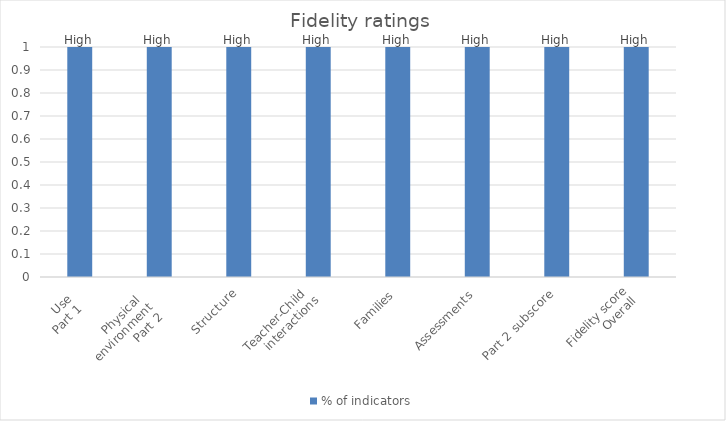
| Category | % of indicators |
|---|---|
| 0 | 1 |
| 1 | 1 |
| 2 | 1 |
| 3 | 1 |
| 4 | 1 |
| 5 | 1 |
| 6 | 1 |
| 7 | 1 |